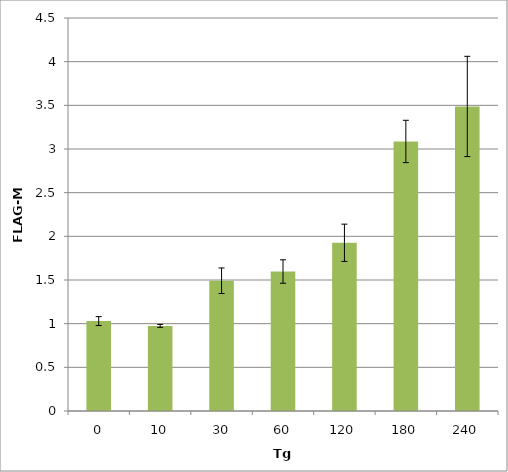
| Category | FLAG-M1 |
|---|---|
| 0.0 | 1.03 |
| 10.0 | 0.975 |
| 30.0 | 1.492 |
| 60.0 | 1.597 |
| 120.0 | 1.926 |
| 180.0 | 3.086 |
| 240.0 | 3.487 |